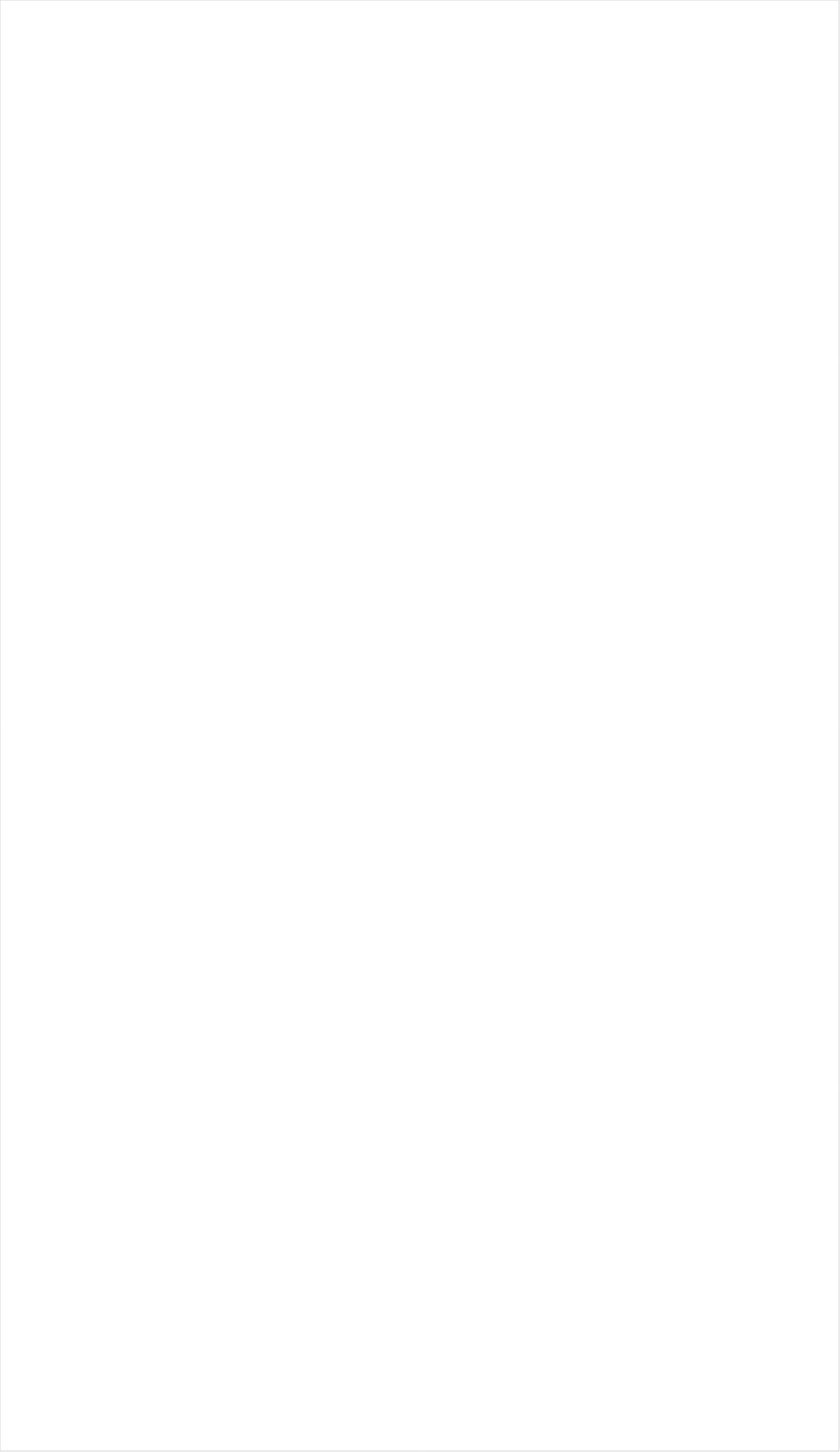
| Category | Total |
|---|---|
| Galavision | -0.93 |
| UniMas | -0.91 |
| Univision | -0.89 |
| BET Her | -0.848 |
| Telemundo | -0.83 |
| TUDN | -0.807 |
| ESPN Deportes | -0.796 |
| BET | -0.728 |
| TV ONE | -0.708 |
| VH1 | -0.691 |
| NBC Universo | -0.67 |
| Cartoon Network | -0.561 |
| Lifetime Movies | -0.52 |
| Oprah Winfrey Network | -0.492 |
| MTV2 | -0.458 |
| MyNetworkTV | -0.381 |
| INSP | -0.358 |
| Disney Channel | -0.332 |
| Disney Junior US | -0.27 |
| Disney XD | -0.258 |
| Hallmark Movies & Mysteries | -0.25 |
| Nick Toons | -0.243 |
| Nick Jr. | -0.233 |
| Nick | -0.221 |
| Investigation Discovery | -0.218 |
| Hallmark | -0.215 |
| WE TV | -0.206 |
| Lifetime | -0.195 |
| RFD TV | -0.177 |
| OXYGEN | -0.152 |
| TLC | -0.123 |
| Universal Kids | -0.095 |
| E! | -0.081 |
| Headline News | -0.056 |
| UP TV | -0.049 |
| Nick@Nite | -0.034 |
| Discovery Family Channel | -0.02 |
| Logo | -0.007 |
| ION | -0.001 |
| Game Show | 0.045 |
| Adult Swim | 0.05 |
| MSNBC | 0.061 |
| Travel | 0.072 |
| BRAVO | 0.074 |
| CW | 0.077 |
| National Geographic Wild | 0.082 |
| FOX | 0.096 |
| ABC | 0.096 |
| A&E | 0.127 |
| CNN | 0.131 |
| Great American Country | 0.136 |
| HGTV | 0.141 |
| FX Movie Channel | 0.152 |
| CMTV | 0.154 |
| Fox Business | 0.161 |
| FX | 0.164 |
| MTV | 0.187 |
| CBS | 0.191 |
| Reelz Channel | 0.203 |
| Motor Trend Network | 0.21 |
| TV LAND | 0.214 |
| NBC | 0.223 |
| SYFY | 0.235 |
| PBS | 0.241 |
| Discovery Channel | 0.242 |
| Fox News | 0.249 |
| Ovation | 0.265 |
| USA Network | 0.267 |
| NBA TV | 0.275 |
| History Channel | 0.284 |
| Teen Nick | 0.295 |
| FXX | 0.313 |
| Freeform | 0.33 |
| POP | 0.348 |
| Animal Planet | 0.352 |
| AMC | 0.361 |
| FYI | 0.383 |
| SundanceTV | 0.388 |
| American Heroes Channel | 0.444 |
| WGN America | 0.46 |
| Paramount Network | 0.462 |
| Outdoor Channel | 0.468 |
| Food Network | 0.475 |
| Cooking Channel | 0.48 |
| TNT | 0.481 |
| TBS | 0.487 |
| Discovery Life Channel | 0.488 |
| Weather Channel | 0.49 |
| Science Channel | 0.493 |
| CNBC | 0.505 |
| DIY | 0.509 |
| Tennis Channel | 0.512 |
| Smithsonian | 0.531 |
| Destination America | 0.534 |
| National Geographic | 0.561 |
| PAC-12 Network | 0.606 |
| The Sportsman Channel | 0.61 |
| BBC America | 0.621 |
| FXDEP | 0.629 |
| Viceland | 0.643 |
| Bloomberg HD | 0.69 |
| truTV | 0.698 |
| CBS Sports | 0.765 |
| Comedy Central | 0.797 |
| ESPN | 0.84 |
| Independent Film (IFC) | 0.978 |
| ESPN2 | 1.266 |
| NFL Network | 1.347 |
| ESPNU | 1.418 |
| ESPNEWS | 1.473 |
| Fox Sports 1 | 1.846 |
| Golf | 1.923 |
| Big Ten Network | 1.972 |
| MLB Network | 2.525 |
| NBC Sports | 2.589 |
| Olympic Channel | 3.069 |
| NHL | 17.045 |